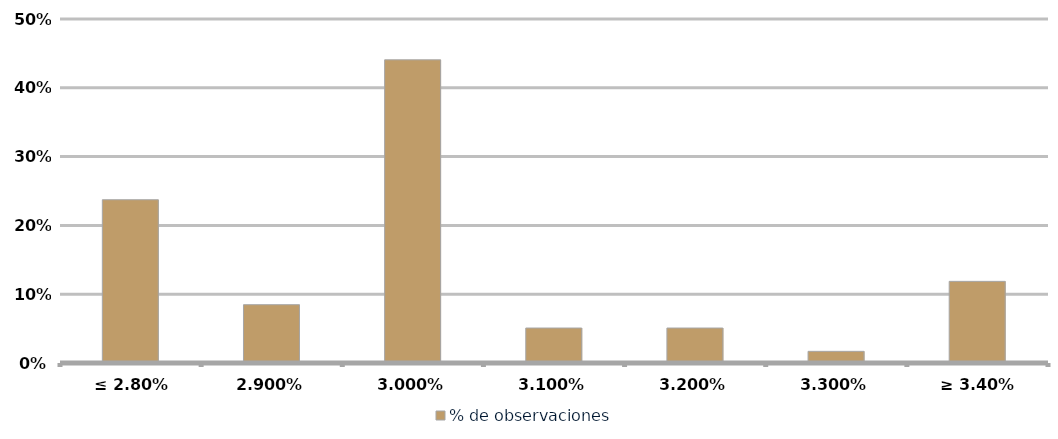
| Category | % de observaciones  |
|---|---|
| ≤ 2.80% | 0.237 |
| 2,90% | 0.085 |
| 3,00% | 0.441 |
| 3,10% | 0.051 |
| 3,20% | 0.051 |
| 3,30% | 0.017 |
| ≥ 3.40% | 0.119 |